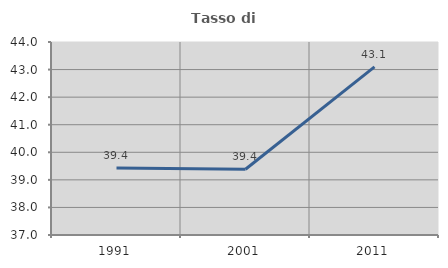
| Category | Tasso di occupazione   |
|---|---|
| 1991.0 | 39.434 |
| 2001.0 | 39.386 |
| 2011.0 | 43.096 |